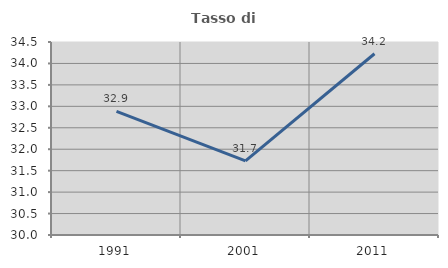
| Category | Tasso di occupazione   |
|---|---|
| 1991.0 | 32.881 |
| 2001.0 | 31.73 |
| 2011.0 | 34.227 |